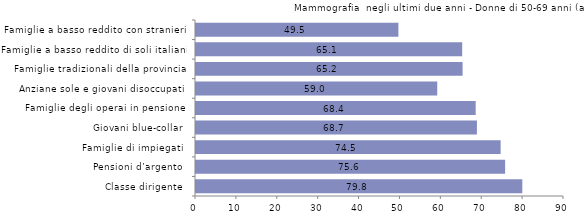
| Category | 79.8 |
|---|---|
| Classe dirigente  | 79.8 |
| Pensioni d’argento  | 75.6 |
| Famiglie di impiegati  | 74.5 |
| Giovani blue-collar  | 68.7 |
| Famiglie degli operai in pensione  | 68.4 |
| Anziane sole e giovani disoccupati  | 59 |
| Famiglie tradizionali della provincia  | 65.2 |
| Famiglie a basso reddito di soli italiani  | 65.1 |
| Famiglie a basso reddito con stranieri  | 49.5 |